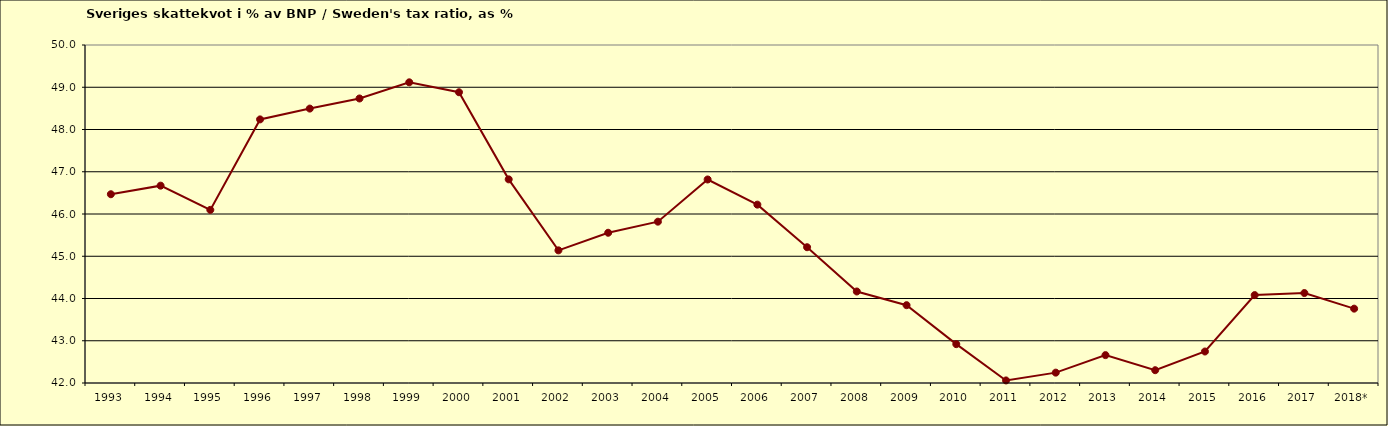
| Category | Series 0 |
|---|---|
| 1993 | 46.468 |
| 1994 | 46.671 |
| 1995 | 46.097 |
| 1996 | 48.239 |
| 1997 | 48.495 |
| 1998 | 48.734 |
| 1999 | 49.117 |
| 2000 | 48.881 |
| 2001 | 46.82 |
| 2002 | 45.14 |
| 2003 | 45.556 |
| 2004 | 45.818 |
| 2005 | 46.817 |
| 2006 | 46.222 |
| 2007 | 45.213 |
| 2008 | 44.166 |
| 2009 | 43.842 |
| 2010 | 42.919 |
| 2011 | 42.061 |
| 2012 | 42.245 |
| 2013 | 42.66 |
| 2014 | 42.303 |
| 2015 | 42.745 |
| 2016 | 44.08 |
| 2017 | 44.129 |
| 2018* | 43.76 |